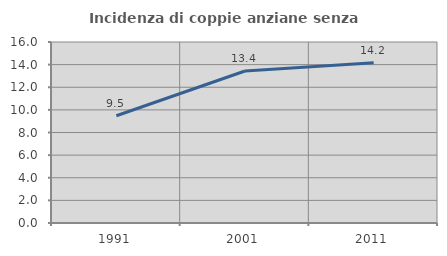
| Category | Incidenza di coppie anziane senza figli  |
|---|---|
| 1991.0 | 9.483 |
| 2001.0 | 13.436 |
| 2011.0 | 14.155 |